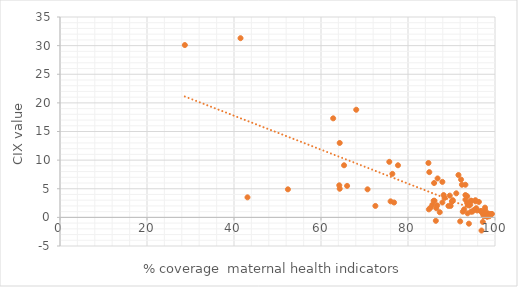
| Category | CIX |
|---|---|
| 89.8 | 2 |
| 97.3 | 0.7 |
| 87.9 | 2.6 |
| 99.3 | 0.6 |
| 70.7 | 4.9 |
| 96.9 | -2.3 |
| 98.9 | 0.4 |
| 92.6 | 1 |
| 97.2 | -0.8 |
| 66.0 | 5.5 |
| 96.7 | 1.1 |
| 96.8 | 1.1 |
| 89.6 | 3.8 |
| 93.8 | 2.1 |
| 86.5 | 1.6 |
| 96.3 | 2.7 |
| 90.2 | 2.8 |
| 94.0 | -1.1 |
| 89.3 | 2 |
| 98.4 | 0.7 |
| 92.9 | 1.4 |
| 97.2 | 0.6 |
| 85.2 | 1.7 |
| 94.5 | 1 |
| 98.7 | 0.2 |
| 88.2 | 3.9 |
| 91.1 | 4.2 |
| 90.1 | 2.8 |
| 94.8 | 1 |
| 84.8 | 1.4 |
| 93.7 | 0.7 |
| 97.7 | 1.3 |
| 85.9 | 2.9 |
| 62.8 | 17.3 |
| 65.3 | 9.1 |
| 77.7 | 9.1 |
| 68.1 | 18.8 |
| 86.7 | 2.1 |
| 93.6 | 3.7 |
| 52.4 | 4.9 |
| 93.2 | 3.9 |
| 92.4 | 5.7 |
| 64.3 | 13 |
| 75.7 | 9.7 |
| 43.1 | 3.5 |
| 28.7 | 30.1 |
| 41.5 | 31.3 |
| 88.4 | 3.4 |
| 86.0 | 6 |
| 76.0 | 2.8 |
| 84.9 | 7.9 |
| 84.7 | 9.5 |
| 85.6 | 2.2 |
| 97.4 | 0.2 |
| 99.1 | 0.6 |
| 94.3 | 2.2 |
| 90.3 | 3 |
| 86.1 | 2.9 |
| 95.2 | 1.3 |
| 97.7 | 1.7 |
| 87.9 | 6.2 |
| 86.8 | 6.8 |
| 76.4 | 7.6 |
| 92.2 | 6.6 |
| 91.6 | 7.4 |
| 93.6 | 2.5 |
| 94.5 | 2.9 |
| 86.4 | -0.6 |
| 94.5 | 2.9 |
| 95.5 | 3 |
| 95.7 | 1.6 |
| 93.2 | 3.1 |
| 64.2 | 5.6 |
| 95.5 | 2.8 |
| 93.2 | 5.7 |
| 95.9 | 1.2 |
| 72.5 | 2 |
| 87.3 | 0.9 |
| 97.7 | 0.3 |
| 64.3 | 5 |
| 92.0 | -0.7 |
| 98.0 | 0.5 |
| 76.8 | 2.6 |
| 98.1 | 0.2 |
| 98.2 | 0.1 |